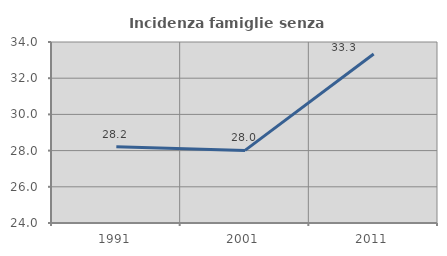
| Category | Incidenza famiglie senza nuclei |
|---|---|
| 1991.0 | 28.212 |
| 2001.0 | 28.01 |
| 2011.0 | 33.333 |